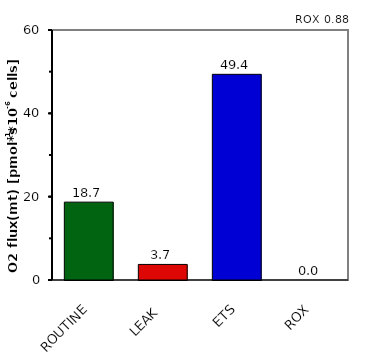
| Category | ROX 0,88 |
|---|---|
| ROUTINE | 18.688 |
| LEAK | 3.737 |
| ETS | 49.363 |
| ROX | 0 |